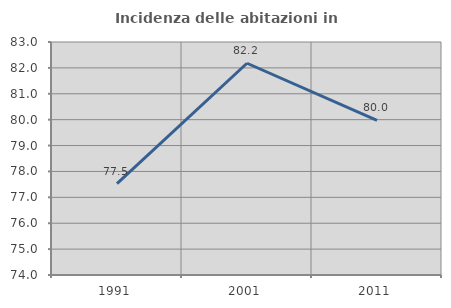
| Category | Incidenza delle abitazioni in proprietà  |
|---|---|
| 1991.0 | 77.531 |
| 2001.0 | 82.179 |
| 2011.0 | 79.972 |